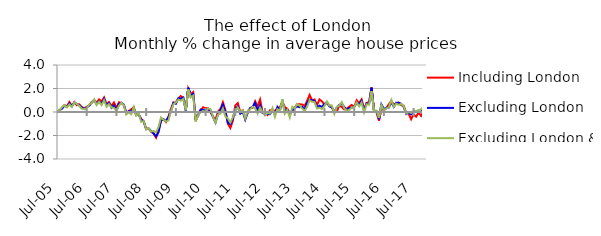
| Category | Including London | Excluding London | Excluding London & SE |
|---|---|---|---|
| 2005-07-01 | 0.002 | -0.033 | 0.065 |
| 2005-08-01 | 0.136 | 0.165 | 0.111 |
| 2005-09-01 | 0.293 | 0.287 | 0.413 |
| 2005-10-01 | 0.583 | 0.543 | 0.582 |
| 2005-11-01 | 0.486 | 0.43 | 0.393 |
| 2005-12-01 | 0.852 | 0.723 | 0.64 |
| 2006-01-01 | 0.504 | 0.5 | 0.426 |
| 2006-02-01 | 0.847 | 0.811 | 0.825 |
| 2006-03-01 | 0.574 | 0.673 | 0.683 |
| 2006-04-01 | 0.658 | 0.578 | 0.525 |
| 2006-05-01 | 0.417 | 0.369 | 0.274 |
| 2006-06-01 | 0.318 | 0.241 | 0.247 |
| 2006-07-01 | 0.428 | 0.393 | 0.317 |
| 2006-08-01 | 0.567 | 0.554 | 0.635 |
| 2006-09-01 | 0.838 | 0.781 | 0.757 |
| 2006-10-01 | 0.991 | 1.027 | 1.077 |
| 2006-11-01 | 0.814 | 0.656 | 0.596 |
| 2006-12-01 | 1.073 | 0.902 | 0.876 |
| 2007-01-01 | 0.89 | 0.682 | 0.584 |
| 2007-02-01 | 1.238 | 1.116 | 1.009 |
| 2007-03-01 | 0.672 | 0.577 | 0.44 |
| 2007-04-01 | 0.843 | 0.768 | 0.681 |
| 2007-05-01 | 0.507 | 0.364 | 0.384 |
| 2007-06-01 | 0.806 | 0.566 | 0.364 |
| 2007-07-01 | 0.341 | 0.098 | 0.071 |
| 2007-08-01 | 0.825 | 0.692 | 0.525 |
| 2007-09-01 | 0.776 | 0.787 | 0.797 |
| 2007-10-01 | 0.57 | 0.628 | 0.589 |
| 2007-11-01 | -0.115 | -0.075 | -0.211 |
| 2007-12-01 | 0.093 | 0.053 | -0.03 |
| 2008-01-01 | 0.224 | 0.062 | -0.191 |
| 2008-02-01 | 0.41 | 0.322 | 0.409 |
| 2008-03-01 | -0.272 | -0.256 | -0.301 |
| 2008-04-01 | -0.209 | -0.196 | -0.127 |
| 2008-05-01 | -0.6 | -0.643 | -0.835 |
| 2008-06-01 | -0.774 | -0.814 | -0.778 |
| 2008-07-01 | -1.438 | -1.466 | -1.475 |
| 2008-08-01 | -1.396 | -1.413 | -1.391 |
| 2008-09-01 | -1.689 | -1.609 | -1.664 |
| 2008-10-01 | -1.838 | -1.821 | -1.619 |
| 2008-11-01 | -2.187 | -2.073 | -1.726 |
| 2008-12-01 | -1.566 | -1.716 | -1.275 |
| 2009-01-01 | -0.751 | -0.699 | -0.472 |
| 2009-02-01 | -0.62 | -0.626 | -0.66 |
| 2009-03-01 | -0.854 | -0.782 | -0.815 |
| 2009-04-01 | -0.417 | -0.423 | -0.723 |
| 2009-05-01 | 0.276 | 0.04 | 0.068 |
| 2009-06-01 | 0.804 | 0.784 | 0.667 |
| 2009-07-01 | 0.826 | 0.702 | 0.802 |
| 2009-08-01 | 1.14 | 1.17 | 1.052 |
| 2009-09-01 | 1.356 | 1.113 | 0.967 |
| 2009-10-01 | 1.173 | 1.234 | 1.112 |
| 2009-11-01 | 0.2 | 0.114 | 0.148 |
| 2009-12-01 | 2.008 | 2.059 | 1.919 |
| 2010-01-01 | 1.536 | 1.365 | 1.246 |
| 2010-02-01 | 1.696 | 1.535 | 1.391 |
| 2010-03-01 | -0.634 | -0.697 | -0.8 |
| 2010-04-01 | -0.334 | -0.228 | -0.265 |
| 2010-05-01 | 0.108 | 0.21 | -0.023 |
| 2010-06-01 | 0.402 | 0.17 | 0.088 |
| 2010-07-01 | 0.318 | 0.134 | -0.017 |
| 2010-08-01 | 0.328 | 0.256 | 0.315 |
| 2010-09-01 | -0.044 | 0.094 | 0.237 |
| 2010-10-01 | -0.375 | -0.441 | -0.416 |
| 2010-11-01 | -0.683 | -0.902 | -0.899 |
| 2010-12-01 | 0.039 | -0.183 | -0.213 |
| 2011-01-01 | 0.267 | 0.166 | -0.126 |
| 2011-02-01 | 0.826 | 0.625 | 0.304 |
| 2011-03-01 | 0.158 | -0.016 | -0.396 |
| 2011-04-01 | -1.001 | -0.913 | -0.552 |
| 2011-05-01 | -1.364 | -1.042 | -0.9 |
| 2011-06-01 | -0.754 | -0.571 | -0.457 |
| 2011-07-01 | 0.56 | 0.254 | 0.104 |
| 2011-08-01 | 0.758 | 0.475 | 0.391 |
| 2011-09-01 | 0.004 | -0.143 | -0.01 |
| 2011-10-01 | 0.147 | 0.022 | 0.157 |
| 2011-11-01 | -0.577 | -0.64 | -0.548 |
| 2011-12-01 | 0.045 | -0.074 | 0.077 |
| 2012-01-01 | 0.327 | 0.333 | 0.218 |
| 2012-02-01 | 0.353 | 0.443 | 0.447 |
| 2012-03-01 | 0.915 | 0.779 | 0.311 |
| 2012-04-01 | 0.467 | 0.089 | -0.132 |
| 2012-05-01 | 1.056 | 0.582 | 0.367 |
| 2012-06-01 | 0.009 | -0.086 | 0.002 |
| 2012-07-01 | -0.075 | -0.148 | -0.296 |
| 2012-08-01 | -0.251 | -0.171 | -0.069 |
| 2012-09-01 | 0.151 | -0.185 | -0.138 |
| 2012-10-01 | 0.163 | 0.163 | 0.335 |
| 2012-11-01 | 0.087 | -0.237 | -0.41 |
| 2012-12-01 | 0.326 | 0.422 | 0.241 |
| 2013-01-01 | 0.396 | 0.121 | 0.1 |
| 2013-02-01 | 0.863 | 0.948 | 1.091 |
| 2013-03-01 | 0.42 | 0.085 | -0.144 |
| 2013-04-01 | 0.275 | 0.198 | 0.183 |
| 2013-05-01 | -0.091 | -0.224 | -0.461 |
| 2013-06-01 | 0.108 | 0.148 | 0.441 |
| 2013-07-01 | 0.378 | 0.337 | 0.308 |
| 2013-08-01 | 0.676 | 0.47 | 0.683 |
| 2013-09-01 | 0.651 | 0.409 | 0.535 |
| 2013-10-01 | 0.645 | 0.44 | 0.304 |
| 2013-11-01 | 0.504 | 0.206 | 0.076 |
| 2013-12-01 | 0.954 | 0.779 | 0.462 |
| 2014-01-01 | 1.451 | 1.034 | 0.996 |
| 2014-02-01 | 0.982 | 1.01 | 0.878 |
| 2014-03-01 | 1.067 | 0.93 | 0.844 |
| 2014-04-01 | 0.586 | 0.397 | 0.296 |
| 2014-05-01 | 1.071 | 0.534 | 0.364 |
| 2014-06-01 | 0.899 | 0.438 | 0.26 |
| 2014-07-01 | 0.632 | 0.687 | 0.513 |
| 2014-08-01 | 0.75 | 0.819 | 0.901 |
| 2014-09-01 | 0.589 | 0.473 | 0.538 |
| 2014-10-01 | 0.384 | 0.408 | 0.548 |
| 2014-11-01 | -0.007 | -0.004 | -0.156 |
| 2014-12-01 | 0.065 | 0.39 | 0.441 |
| 2015-01-01 | 0.533 | 0.592 | 0.531 |
| 2015-02-01 | 0.431 | 0.709 | 0.846 |
| 2015-03-01 | 0.224 | 0.423 | 0.319 |
| 2015-04-01 | 0.295 | 0.159 | 0.12 |
| 2015-05-01 | 0.445 | 0.334 | 0.18 |
| 2015-06-01 | 0.604 | 0.358 | 0.376 |
| 2015-07-01 | 0.411 | 0.457 | 0.421 |
| 2015-08-01 | 1.001 | 0.742 | 0.824 |
| 2015-09-01 | 0.75 | 0.667 | 0.482 |
| 2015-10-01 | 1.069 | 0.943 | 0.815 |
| 2015-11-01 | 0.232 | 0.114 | -0.035 |
| 2015-12-01 | 0.775 | 0.717 | 0.659 |
| 2016-01-01 | 0.836 | 0.683 | 0.62 |
| 2016-02-01 | 2.097 | 2.057 | 1.784 |
| 2016-03-01 | 0.194 | 0.07 | 0.08 |
| 2016-04-01 | -0.036 | 0.072 | 0.121 |
| 2016-05-01 | -0.729 | -0.613 | -0.513 |
| 2016-06-01 | 0.285 | 0.645 | 0.587 |
| 2016-07-01 | 0.147 | 0.272 | 0.145 |
| 2016-08-01 | 0.327 | 0.35 | 0.309 |
| 2016-09-01 | 0.666 | 0.381 | 0.4 |
| 2016-10-01 | 0.947 | 0.84 | 1.02 |
| 2016-11-01 | 0.639 | 0.434 | 0.453 |
| 2016-12-01 | 0.737 | 0.795 | 0.708 |
| 2017-01-01 | 0.801 | 0.781 | 0.613 |
| 2017-02-01 | 0.576 | 0.697 | 0.685 |
| 2017-03-01 | 0.534 | 0.422 | 0.486 |
| 2017-04-01 | -0.058 | -0.165 | -0.123 |
| 2017-05-01 | -0.13 | -0.044 | -0.01 |
| 2017-06-01 | -0.621 | -0.187 | -0.083 |
| 2017-07-01 | -0.204 | 0.073 | 0.115 |
| 2017-08-01 | -0.398 | 0.006 | 0.07 |
| 2017-09-01 | -0.053 | 0.008 | 0.17 |
| 2017-10-01 | -0.331 | 0.037 | 0.213 |
| 2017-11-01 | 0.048 | 0.19 | 0.45 |
| 2017-12-01 | 0.03 | 0.261 | 0.345 |